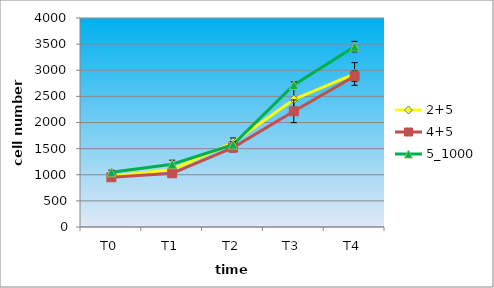
| Category | 2+5 | 4+5 | 5_1000 |
|---|---|---|---|
| T0 | 964.444 | 952.222 | 1046.111 |
| T1 | 1100 | 1027.778 | 1200.556 |
| T2 | 1616.667 | 1518.889 | 1575.556 |
| T3 | 2441.111 | 2214.444 | 2717.778 |
| T4 | 2928.889 | 2885.556 | 3452.222 |